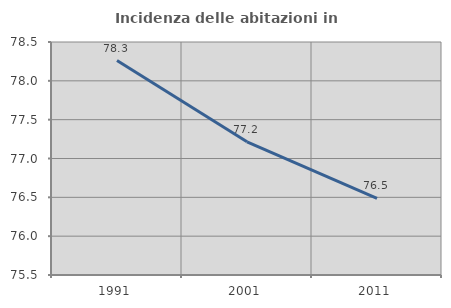
| Category | Incidenza delle abitazioni in proprietà  |
|---|---|
| 1991.0 | 78.261 |
| 2001.0 | 77.215 |
| 2011.0 | 76.485 |